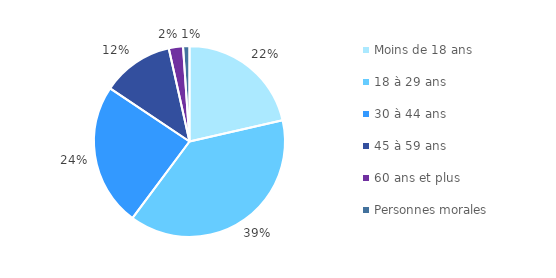
| Category | Pourcentage |
|---|---|
| Moins de 18 ans | 0.214 |
| 18 à 29 ans | 0.388 |
| 30 à 44 ans | 0.242 |
| 45 à 59 ans | 0.121 |
| 60 ans et plus | 0.024 |
| Personnes morales | 0.011 |